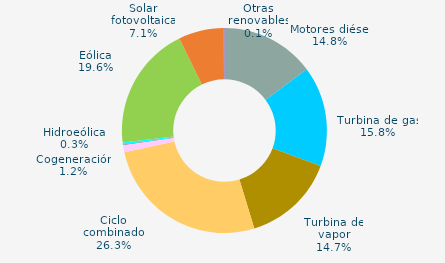
| Category | Series 0 |
|---|---|
| Motores diésel | 14.816 |
| Turbina de gas | 15.822 |
| Turbina de vapor | 14.664 |
| Ciclo combinado | 26.294 |
| Cogeneración | 1.161 |
| Hidráulica | 0.046 |
| Hidroeólica | 0.344 |
| Eólica | 19.588 |
| Solar fotovoltaica | 7.122 |
| Otras renovables | 0.143 |